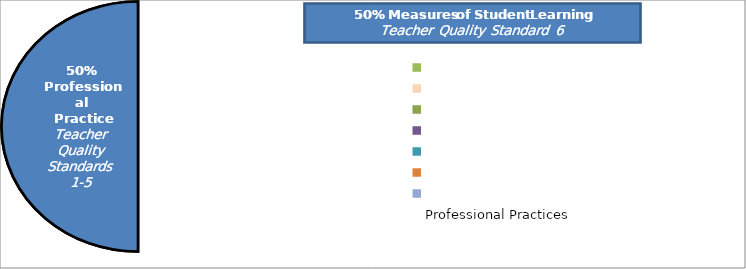
| Category | Series 0 |
|---|---|
|  | 0 |
|  | 0 |
|  | 0 |
|  | 0 |
|  | 0 |
|  | 0 |
|  | 0 |
| Professional Practices | 0 |